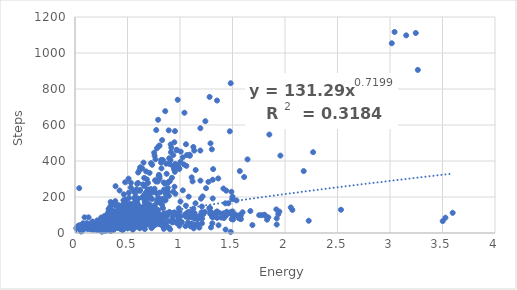
| Category | Steps |
|---|---|
| 0.2355 | 68 |
| 0.7919999999999999 | 55 |
| 0.7288571428571428 | 102 |
| 0.7101 | 334 |
| 0.5065 | 48 |
| 0.181 | 41 |
| 0.6684444444444445 | 176 |
| 0.172 | 37 |
| 1.211 | 80 |
| 1.1475 | 165 |
| 0.6620909090909092 | 260 |
| 0.223 | 35 |
| 0.124 | 27 |
| 0.092 | 25 |
| 1.209 | 54 |
| 0.7837 | 182 |
| 0.7837 | 172 |
| 0.8087777777777778 | 225 |
| 0.8896000000000001 | 282 |
| 0.5495 | 107 |
| 0.683 | 60 |
| 0.521 | 68 |
| 0.6083333333333333 | 93 |
| 0.673875 | 96 |
| 1.289 | 118 |
| 1.569625 | 344 |
| 1.776 | 99 |
| 1.807 | 100 |
| 0.727 | 33 |
| 0.342 | 23 |
| 0.2822 | 29 |
| 0.35444444444444445 | 59 |
| 0.347125 | 77 |
| 0.37200000000000005 | 20 |
| 0.9015833333333334 | 383 |
| 0.201 | 18 |
| 0.7879999999999999 | 173 |
| 0.5661250000000001 | 192 |
| 0.081 | 27 |
| 0.3807777777777777 | 82 |
| 0.42619999999999997 | 80 |
| 0.43433333333333335 | 75 |
| 0.43722222222222223 | 106 |
| 0.289 | 37 |
| 0.3672 | 86 |
| 0.35716666666666663 | 80 |
| 0.2643636363636364 | 54 |
| 0.8233846153846153 | 359 |
| 0.7581538461538462 | 429 |
| 0.7660666666666668 | 409 |
| 1.353 | 120 |
| 1.936 | 105 |
| 0.9276666666666666 | 86 |
| 0.4415 | 55 |
| 0.6661428571428571 | 159 |
| 0.5529999999999999 | 46 |
| 0.588142857142857 | 172 |
| 0.43800000000000006 | 69 |
| 0.2905 | 56 |
| 0.057 | 15 |
| 0.3216666666666667 | 16 |
| 0.3049 | 38 |
| 0.41600000000000004 | 27 |
| 0.36012500000000003 | 49 |
| 0.36012500000000003 | 56 |
| 0.2855 | 41 |
| 0.505 | 94 |
| 0.7914705882352943 | 629 |
| 0.317 | 49 |
| 1.142 | 79 |
| 1.131 | 98 |
| 0.66 | 84 |
| 0.5830000000000001 | 64 |
| 0.869375 | 385 |
| 1.4135 | 247 |
| 0.6408 | 107 |
| 1.353 | 84 |
| 0.38849999999999996 | 73 |
| 0.095 | 26 |
| 0.461 | 28 |
| 0.7605999999999999 | 148 |
| 0.521 | 116 |
| 0.5225000000000001 | 92 |
| 0.5225000000000001 | 57 |
| 0.322 | 18 |
| 0.5894285714285715 | 91 |
| 0.45549999999999996 | 25 |
| 1.0476666666666667 | 102 |
| 0.375 | 58 |
| 0.8963571428571429 | 415 |
| 1.122 | 111 |
| 1.443 | 103 |
| 1.131 | 26 |
| 1.392 | 86 |
| 0.6805555555555556 | 143 |
| 0.6805555555555556 | 104 |
| 0.5905714285714285 | 124 |
| 0.444125 | 146 |
| 0.41850000000000004 | 54 |
| 0.4171428571428572 | 123 |
| 0.498 | 87 |
| 0.40066666666666667 | 38 |
| 0.6267777777777779 | 143 |
| 0.49600000000000005 | 84 |
| 0.43520000000000003 | 22 |
| 0.5825 | 46 |
| 0.7589999999999999 | 75 |
| 0.4650000000000001 | 215 |
| 0.7224444444444444 | 244 |
| 0.617125 | 26 |
| 0.222 | 28 |
| 0.43439999999999995 | 150 |
| 0.39025 | 103 |
| 0.4151999999999999 | 110 |
| 0.5853333333333334 | 121 |
| 0.97975 | 374 |
| 1.492 | 77 |
| 0.8455 | 106 |
| 0.8285 | 81 |
| 0.285 | 21 |
| 0.8835714285714286 | 251 |
| 0.41871428571428576 | 52 |
| 0.38599999999999995 | 69 |
| 0.5128888888888888 | 136 |
| 0.4614 | 127 |
| 0.5147 | 195 |
| 0.582125 | 117 |
| 0.067 | 12 |
| 0.527 | 99 |
| 0.36574999999999996 | 36 |
| 0.23075 | 26 |
| 0.23075 | 20 |
| 0.4468571428571429 | 56 |
| 0.313 | 17 |
| 0.46099999999999997 | 48 |
| 0.20425 | 36 |
| 0.30025 | 42 |
| 0.3501666666666667 | 46 |
| 0.3662 | 52 |
| 0.414 | 36 |
| 0.39440000000000003 | 46 |
| 0.29733333333333334 | 36 |
| 0.30949999999999994 | 53 |
| 0.9695714285714285 | 462 |
| 0.361 | 31 |
| 0.927 | 61 |
| 0.9329999999999999 | 111 |
| 1.118 | 94 |
| 0.7110000000000001 | 119 |
| 0.6788181818181819 | 164 |
| 0.7652000000000001 | 46 |
| 0.318 | 60 |
| 1.5003333333333335 | 202 |
| 0.7090000000000001 | 206 |
| 0.7090000000000001 | 206 |
| 3.502 | 66 |
| 0.681 | 109 |
| 1.367 | 43 |
| 0.476 | 187 |
| 1.496 | 101 |
| 1.4316666666666666 | 165 |
| 1.237 | 117 |
| 0.5786 | 70 |
| 0.41974999999999996 | 80 |
| 0.494 | 32 |
| 0.49099999999999994 | 35 |
| 0.44399999999999995 | 23 |
| 0.6017142857142856 | 336 |
| 0.242 | 15 |
| 0.30833333333333335 | 35 |
| 0.33699999999999997 | 27 |
| 0.8465714285714286 | 280 |
| 0.6148571428571429 | 93 |
| 0.409 | 45 |
| 0.8861111111111111 | 227 |
| 0.225 | 26 |
| 0.9361249999999999 | 230 |
| 0.5922000000000001 | 89 |
| 0.6885 | 75 |
| 0.84775 | 241 |
| 0.3574285714285714 | 85 |
| 0.287 | 33 |
| 0.46875 | 104 |
| 0.6984999999999999 | 64 |
| 0.8147499999999999 | 166 |
| 0.609625 | 47 |
| 0.65 | 53 |
| 0.408875 | 112 |
| 0.34766666666666673 | 78 |
| 0.5826666666666667 | 60 |
| 0.47624999999999995 | 77 |
| 0.114 | 39 |
| 0.623125 | 131 |
| 0.473875 | 117 |
| 0.6515 | 65 |
| 0.314 | 71 |
| 0.21900000000000003 | 23 |
| 0.509 | 126 |
| 0.247 | 54 |
| 1.559 | 83 |
| 0.5511111111111112 | 141 |
| 1.1165 | 102 |
| 0.401 | 38 |
| 0.7373333333333333 | 129 |
| 0.601 | 35 |
| 1.1273333333333333 | 135 |
| 0.16699999999999998 | 32 |
| 1.3056666666666668 | 89 |
| 0.647 | 111 |
| 1.8508000000000002 | 547 |
| 1.006 | 93 |
| 1.4743000000000002 | 565 |
| 1.3156666666666665 | 355 |
| 0.39399999999999996 | 41 |
| 0.8542000000000002 | 226 |
| 0.8542000000000002 | 275 |
| 0.45299999999999996 | 15 |
| 0.34625 | 45 |
| 2.07 | 128 |
| 0.429 | 36 |
| 0.247 | 59 |
| 0.3204444444444445 | 65 |
| 0.39 | 44 |
| 0.8275714285714285 | 186 |
| 3.528 | 85 |
| 0.41450000000000004 | 80 |
| 0.41450000000000004 | 89 |
| 0.042 | 43 |
| 1.921 | 47 |
| 0.5681666666666667 | 84 |
| 0.27740000000000004 | 63 |
| 0.152 | 22 |
| 0.6333333333333333 | 59 |
| 0.37188888888888894 | 107 |
| 0.37188888888888894 | 64 |
| 0.41411111111111115 | 36 |
| 0.4962857142857143 | 89 |
| 0.391625 | 115 |
| 0.38425 | 66 |
| 0.733 | 93 |
| 0.166 | 64 |
| 0.25 | 86 |
| 0.25 | 55 |
| 0.7548333333333331 | 153 |
| 0.739 | 35 |
| 0.6145384615384615 | 349 |
| 0.5322499999999999 | 279 |
| 0.6290000000000001 | 114 |
| 2.0549999999999997 | 142 |
| 1.917333333333333 | 131 |
| 0.7985 | 106 |
| 1.0045 | 175 |
| 0.36037500000000006 | 60 |
| 0.877 | 98 |
| 0.6456 | 139 |
| 0.713 | 52 |
| 1.4898571428571425 | 229 |
| 1.2479999999999998 | 249 |
| 0.4064285714285714 | 121 |
| 0.36366666666666664 | 76 |
| 0.37316666666666665 | 47 |
| 0.314 | 52 |
| 0.28 | 94 |
| 0.9678421052631578 | 460 |
| 3.597 | 112 |
| 0.8905000000000001 | 66 |
| 0.30254545454545456 | 78 |
| 0.38630000000000003 | 99 |
| 0.32314285714285723 | 55 |
| 0.49666666666666665 | 120 |
| 0.4146666666666667 | 62 |
| 0.363090909090909 | 65 |
| 0.38025 | 33 |
| 0.6543333333333333 | 122 |
| 0.630375 | 128 |
| 0.4505 | 89 |
| 0.45228571428571435 | 107 |
| 0.5013333333333333 | 26 |
| 0.3237272727272727 | 31 |
| 0.4635555555555556 | 110 |
| 0.427 | 151 |
| 0.3470000000000001 | 62 |
| 0.9518666666666664 | 566 |
| 0.859 | 54 |
| 1.063 | 99 |
| 1.418 | 83 |
| 1.453 | 112 |
| 1.138 | 82 |
| 0.5312857142857143 | 253 |
| 0.846 | 36 |
| 0.212 | 70 |
| 0.9021666666666667 | 288 |
| 0.842 | 102 |
| 0.47792307692307684 | 282 |
| 1.075 | 58 |
| 0.43115384615384617 | 134 |
| 0.46975 | 103 |
| 0.4069 | 31 |
| 0.3337777777777778 | 105 |
| 0.3242857142857143 | 20 |
| 0.7286666666666667 | 238 |
| 0.4574 | 138 |
| 0.41633333333333333 | 128 |
| 0.9175000000000001 | 474 |
| 0.8594545454545454 | 677 |
| 0.22425 | 38 |
| 0.33445454545454545 | 91 |
| 0.076 | 54 |
| 2.533 | 129 |
| 0.029 | 39 |
| 1.111 | 309 |
| 0.7935000000000001 | 92 |
| 0.3196666666666667 | 46 |
| 0.551 | 18 |
| 1.1493333333333333 | 350 |
| 1.53 | 102 |
| 0.5266 | 65 |
| 0.4681 | 61 |
| 1.166 | 49 |
| 1.166 | 79 |
| 0.77 | 108 |
| 0.8093333333333333 | 174 |
| 0.371 | 24 |
| 0.742 | 50 |
| 0.349 | 29 |
| 0.568 | 32 |
| 0.8986666666666666 | 117 |
| 0.5752727272727273 | 105 |
| 0.204 | 24 |
| 0.314 | 40 |
| 0.33340000000000003 | 83 |
| 0.058 | 8 |
| 0.149 | 27 |
| 0.075 | 19 |
| 0.2425 | 74 |
| 0.803 | 91 |
| 1.0570833333333332 | 493 |
| 0.9964999999999999 | 119 |
| 0.973 | 65 |
| 0.3393333333333333 | 72 |
| 0.294 | 29 |
| 0.36960000000000004 | 58 |
| 0.3854444444444444 | 115 |
| 0.4026666666666667 | 65 |
| 0.35000000000000003 | 40 |
| 0.185 | 30 |
| 0.171 | 49 |
| 0.224 | 27 |
| 0.6821999999999999 | 74 |
| 0.057 | 16 |
| 0.48 | 37 |
| 0.7337777777777778 | 189 |
| 0.5048333333333334 | 53 |
| 0.48300000000000004 | 171 |
| 0.4244545454545454 | 236 |
| 0.5207142857142857 | 94 |
| 0.47425000000000006 | 99 |
| 0.2825714285714286 | 18 |
| 0.37942857142857145 | 61 |
| 0.34733333333333344 | 68 |
| 0.3839 | 177 |
| 0.46233333333333326 | 126 |
| 0.186 | 29 |
| 0.6643333333333334 | 173 |
| 0.47688888888888886 | 134 |
| 0.49011111111111105 | 126 |
| 0.7887500000000002 | 286 |
| 0.7394615384615384 | 226 |
| 0.604 | 46 |
| 1.0937142857142856 | 429 |
| 0.151 | 41 |
| 1.372 | 112 |
| 1.438 | 110 |
| 1.434 | 19 |
| 0.695 | 115 |
| 0.936 | 433 |
| 1.498 | 107 |
| 0.9415 | 66 |
| 0.9275 | 59 |
| 0.31839999999999996 | 59 |
| 0.39385714285714285 | 54 |
| 0.517875 | 128 |
| 0.2886 | 12 |
| 0.79175 | 196 |
| 0.3861818181818181 | 260 |
| 0.674 | 64 |
| 0.41130000000000005 | 155 |
| 0.31175 | 52 |
| 0.2484 | 13 |
| 0.7345999999999999 | 379 |
| 0.08 | 39 |
| 0.614 | 49 |
| 1.4831764705882353 | 832 |
| 0.79 | 128 |
| 1.2416363636363634 | 621 |
| 0.195 | 39 |
| 0.091 | 87 |
| 0.091 | 43 |
| 1.611222222222222 | 311 |
| 0.8294999999999998 | 156 |
| 0.5894 | 58 |
| 0.266 | 21 |
| 0.818125 | 169 |
| 0.861 | 184 |
| 0.417 | 116 |
| 0.890625 | 282 |
| 0.5515 | 65 |
| 0.49983333333333335 | 112 |
| 0.676 | 55 |
| 1.6896 | 44 |
| 0.46275 | 47 |
| 0.5961818181818181 | 163 |
| 0.5560833333333334 | 235 |
| 1.0918 | 117 |
| 0.64 | 62 |
| 0.304 | 28 |
| 0.7290000000000001 | 27 |
| 0.707 | 133 |
| 0.865 | 89 |
| 0.723 | 99 |
| 1.0914444444444444 | 435 |
| 1.45 | 110 |
| 0.705 | 59 |
| 0.34700000000000003 | 26 |
| 0.352125 | 41 |
| 0.3056 | 18 |
| 0.30612500000000004 | 16 |
| 0.2968571428571428 | 24 |
| 0.31499999999999995 | 49 |
| 0.30466666666666664 | 24 |
| 0.2672 | 34 |
| 0.37200000000000005 | 80 |
| 0.4305555555555556 | 67 |
| 0.674 | 46 |
| 0.3363333333333334 | 69 |
| 0.247 | 41 |
| 0.30060000000000003 | 38 |
| 0.30060000000000003 | 36 |
| 0.28750000000000003 | 78 |
| 0.3298571428571429 | 22 |
| 0.304 | 69 |
| 0.3522666666666667 | 167 |
| 1.2085 | 147 |
| 1.2705 | 284 |
| 1.308 | 54 |
| 1.335 | 112 |
| 0.987 | 66 |
| 0.9139999999999998 | 449 |
| 0.8725999999999999 | 329 |
| 0.46871428571428575 | 120 |
| 0.4603333333333333 | 77 |
| 0.5127777777777778 | 80 |
| 0.47500000000000003 | 81 |
| 0.29088888888888886 | 24 |
| 0.3341111111111111 | 55 |
| 0.4916666666666667 | 75 |
| 0.5736666666666665 | 76 |
| 0.6295714285714286 | 36 |
| 0.5773333333333334 | 184 |
| 0.8606666666666665 | 181 |
| 0.398 | 53 |
| 0.31670000000000004 | 85 |
| 0.266 | 14 |
| 0.478375 | 122 |
| 0.315 | 21 |
| 0.337 | 27 |
| 0.239 | 41 |
| 0.3998 | 80 |
| 0.519 | 78 |
| 0.8678000000000001 | 213 |
| 0.328 | 34 |
| 0.9932222222222222 | 356 |
| 1.0369 | 381 |
| 0.2434 | 30 |
| 0.27999999999999997 | 17 |
| 1.841 | 87 |
| 0.7802857142857142 | 109 |
| 1.0151428571428571 | 62 |
| 0.691 | 60 |
| 0.994 | 40 |
| 1.0989999999999998 | 37 |
| 1.2001428571428572 | 191 |
| 0.77375 | 222 |
| 0.8606666666666666 | 108 |
| 0.6562 | 85 |
| 0.847 | 38 |
| 0.8069999999999999 | 93 |
| 0.8069999999999999 | 102 |
| 1.0071111111111108 | 452 |
| 1.1938 | 458 |
| 3.0434545454545456 | 1117 |
| 0.984 | 73 |
| 1.52 | 97 |
| 3.1543 | 1098 |
| 3.0168461538461537 | 1054 |
| 3.2453846153846158 | 1111 |
| 3.2653 | 906 |
| 2.17825 | 344 |
| 0.38566666666666666 | 83 |
| 0.3406666666666667 | 47 |
| 0.789 | 68 |
| 0.617 | 234 |
| 0.965 | 58 |
| 0.219 | 17 |
| 0.729 | 83 |
| 0.46681818181818174 | 136 |
| 1.4835 | 6 |
| 1.0658999999999998 | 433 |
| 0.947 | 113 |
| 1.411 | 109 |
| 0.847 | 58 |
| 0.6625 | 85 |
| 0.49239999999999995 | 43 |
| 0.3847777777777778 | 117 |
| 0.317 | 115 |
| 0.3005 | 101 |
| 0.33941666666666664 | 172 |
| 0.653 | 90 |
| 0.3197 | 133 |
| 0.363 | 52 |
| 0.425 | 105 |
| 0.6033750000000001 | 74 |
| 0.5644000000000001 | 165 |
| 0.3911 | 95 |
| 0.537 | 62 |
| 0.113 | 55 |
| 0.6224999999999999 | 85 |
| 0.604 | 43 |
| 0.647 | 49 |
| 0.7121999999999999 | 58 |
| 0.2676666666666667 | 44 |
| 0.3103333333333333 | 60 |
| 0.2182 | 60 |
| 0.333 | 31 |
| 1.2906666666666666 | 498 |
| 0.9924444444444445 | 359 |
| 0.35233333333333333 | 95 |
| 1.0257142857142858 | 420 |
| 0.506 | 71 |
| 0.4653333333333333 | 88 |
| 0.473625 | 57 |
| 0.3595 | 70 |
| 0.3484285714285714 | 52 |
| 0.25650000000000006 | 7 |
| 0.4337777777777778 | 75 |
| 0.4995 | 81 |
| 0.5276 | 162 |
| 0.29 | 27 |
| 0.3205 | 96 |
| 0.867 | 230 |
| 0.6584 | 212 |
| 1.295 | 31 |
| 0.4066666666666667 | 122 |
| 0.63 | 52 |
| 0.33690000000000003 | 72 |
| 0.3225 | 65 |
| 0.40392307692307694 | 77 |
| 0.361 | 16 |
| 0.38985714285714285 | 87 |
| 0.30825 | 70 |
| 0.3117272727272727 | 81 |
| 0.37833333333333335 | 51 |
| 0.35900000000000004 | 98 |
| 0.35209090909090907 | 124 |
| 0.3599230769230769 | 157 |
| 0.9512222222222222 | 340 |
| 1.579 | 97 |
| 0.8634999999999999 | 102 |
| 0.9111818181818182 | 492 |
| 1.829 | 74 |
| 1.119 | 103 |
| 0.602 | 42 |
| 1.173 | 79 |
| 0.7046 | 132 |
| 0.34628571428571436 | 69 |
| 0.191 | 44 |
| 0.27140000000000003 | 78 |
| 0.42390000000000005 | 53 |
| 0.7242500000000001 | 54 |
| 0.346 | 46 |
| 0.769 | 124 |
| 0.181 | 39 |
| 0.585625 | 158 |
| 0.6541250000000001 | 131 |
| 1.184 | 30 |
| 0.665 | 22 |
| 0.6274285714285713 | 53 |
| 0.37 | 19 |
| 0.39 | 40 |
| 1.0422727272727275 | 668 |
| 0.643 | 45 |
| 0.014 | 28 |
| 0.5919285714285715 | 273 |
| 0.6957500000000001 | 146 |
| 0.43042857142857144 | 48 |
| 0.7895 | 65 |
| 0.6223333333333333 | 141 |
| 1.1355833333333332 | 458 |
| 0.9464285714285714 | 504 |
| 0.221 | 27 |
| 1.1199999999999999 | 287 |
| 0.82 | 45 |
| 1.057 | 90 |
| 0.923375 | 307 |
| 1.501 | 120 |
| 1.016 | 60 |
| 0.9345454545454545 | 371 |
| 0.324 | 93 |
| 1.205 | 115 |
| 1.4264999999999999 | 105 |
| 0.8214999999999999 | 56 |
| 0.5927142857142857 | 41 |
| 0.588 | 64 |
| 0.088 | 33 |
| 0.38990909090909087 | 151 |
| 0.153 | 29 |
| 0.5419999999999999 | 63 |
| 1.2865 | 139 |
| 1.461 | 165 |
| 0.21066666666666667 | 23 |
| 0.9884000000000001 | 137 |
| 0.9567272727272728 | 218 |
| 0.558 | 78 |
| 1.2818571428571433 | 756 |
| 1.0705 | 111 |
| 0.6074999999999999 | 112 |
| 1.1395 | 110 |
| 1.303 | 110 |
| 0.795 | 69 |
| 1.3525000000000003 | 736 |
| 1.803 | 101 |
| 1.487 | 107 |
| 1.068 | 112 |
| 1.194 | 99 |
| 0.889 | 106 |
| 0.7542857142857142 | 82 |
| 0.631 | 117 |
| 0.36833333333333335 | 77 |
| 0.268 | 21 |
| 0.805142857142857 | 486 |
| 0.8374999999999999 | 405 |
| 0.3846666666666667 | 53 |
| 0.149 | 26 |
| 0.364 | 26 |
| 0.3807142857142857 | 28 |
| 0.3807142857142857 | 76 |
| 0.3674545454545454 | 122 |
| 0.4331111111111111 | 124 |
| 0.834 | 58 |
| 0.431090909090909 | 86 |
| 0.211 | 30 |
| 0.36822222222222223 | 54 |
| 0.36822222222222223 | 75 |
| 0.49418181818181817 | 154 |
| 0.5458888888888889 | 81 |
| 0.4406 | 118 |
| 0.4659 | 88 |
| 0.4659 | 120 |
| 0.449875 | 99 |
| 0.4538888888888889 | 92 |
| 0.4749999999999999 | 74 |
| 0.49549999999999994 | 122 |
| 0.6622222222222223 | 137 |
| 0.6391818181818182 | 197 |
| 0.5797777777777777 | 136 |
| 0.45 | 73 |
| 0.7806923076923076 | 471 |
| 0.723923076923077 | 388 |
| 0.49666666666666665 | 76 |
| 0.9542000000000002 | 384 |
| 0.681 | 90 |
| 0.45520000000000005 | 126 |
| 0.153 | 20 |
| 0.28971428571428565 | 33 |
| 0.31 | 54 |
| 0.014 | 25 |
| 0.5517999999999998 | 89 |
| 0.5517999999999998 | 90 |
| 0.51925 | 130 |
| 0.447 | 46 |
| 0.3824444444444444 | 50 |
| 0.30528571428571427 | 53 |
| 0.32575 | 25 |
| 0.46114285714285713 | 70 |
| 0.28049999999999997 | 21 |
| 0.805 | 301 |
| 0.805 | 314 |
| 0.292625 | 34 |
| 0.28922222222222227 | 65 |
| 0.49337500000000006 | 124 |
| 0.3225 | 67 |
| 0.057 | 12 |
| 0.3882222222222222 | 38 |
| 0.42263636363636364 | 114 |
| 0.28357142857142853 | 87 |
| 0.3956 | 73 |
| 0.3142222222222222 | 53 |
| 0.21783333333333335 | 24 |
| 0.697888888888889 | 193 |
| 0.33 | 48 |
| 1.145 | 43 |
| 1.1125 | 88 |
| 1.147 | 93 |
| 0.076 | 43 |
| 1.643 | 409 |
| 1.4405000000000001 | 235 |
| 0.846 | 23 |
| 0.817 | 68 |
| 1.2153749999999999 | 203 |
| 1.082857142857143 | 202 |
| 0.8257999999999999 | 188 |
| 0.3906666666666667 | 77 |
| 0.228 | 25 |
| 0.38675000000000004 | 50 |
| 0.38675000000000004 | 64 |
| 0.6569090909090909 | 198 |
| 0.5265 | 45 |
| 0.6776666666666666 | 342 |
| 1.436 | 95 |
| 0.6196666666666667 | 240 |
| 0.9755000000000003 | 111 |
| 0.9755000000000003 | 105 |
| 0.6405000000000001 | 74 |
| 0.8643999999999998 | 108 |
| 0.3145 | 27 |
| 0.798 | 51 |
| 0.6186666666666667 | 89 |
| 0.6186666666666667 | 80 |
| 0.344 | 23 |
| 0.8435454545454545 | 189 |
| 0.893875 | 206 |
| 0.6764999999999999 | 164 |
| 0.6764999999999999 | 226 |
| 0.6393333333333334 | 123 |
| 1.4969999999999999 | 189 |
| 1.315 | 88 |
| 0.527 | 55 |
| 0.4128571428571428 | 30 |
| 1.0805 | 116 |
| 1.58 | 77 |
| 1.3114999999999999 | 296 |
| 0.31 | 16 |
| 1.3644 | 303 |
| 0.5644545454545453 | 164 |
| 0.44930769230769224 | 137 |
| 0.9538181818181819 | 380 |
| 0.906 | 20 |
| 0.1915 | 41 |
| 0.246 | 53 |
| 0.673 | 99 |
| 0.238 | 38 |
| 0.667 | 50 |
| 0.5725 | 58 |
| 0.648 | 73 |
| 0.637 | 59 |
| 1.9562222222222223 | 430 |
| 2.225857142857143 | 68 |
| 0.7575833333333334 | 246 |
| 0.303 | 35 |
| 0.7737692307692308 | 286 |
| 0.37728571428571434 | 45 |
| 0.306 | 22 |
| 0.2902857142857143 | 13 |
| 0.9473076923076924 | 257 |
| 0.812 | 54 |
| 1.279 | 138 |
| 1.506 | 75 |
| 0.49674999999999997 | 113 |
| 1.052 | 38 |
| 0.4526 | 125 |
| 0.5108 | 50 |
| 1.3116666666666668 | 192 |
| 1.946 | 119 |
| 0.156 | 55 |
| 2.267666666666667 | 449 |
| 0.3972 | 83 |
| 0.36822222222222223 | 93 |
| 0.5003333333333332 | 85 |
| 0.334375 | 88 |
| 0.302 | 30 |
| 0.5746666666666667 | 203 |
| 0.6487777777777778 | 270 |
| 0.391625 | 73 |
| 0.058 | 23 |
| 0.3577 | 81 |
| 0.443 | 28 |
| 0.31 | 85 |
| 0.531 | 65 |
| 0.635 | 100 |
| 0.3808571428571429 | 50 |
| 0.30633333333333335 | 22 |
| 0.4027 | 76 |
| 0.4027 | 78 |
| 0.48719999999999997 | 180 |
| 0.805 | 50 |
| 0.6000833333333333 | 278 |
| 0.419 | 58 |
| 1.287 | 107 |
| 1.112 | 53 |
| 0.427 | 57 |
| 1.1945999999999999 | 291 |
| 1.538 | 181 |
| 0.32475 | 18 |
| 0.315 | 28 |
| 0.320375 | 49 |
| 0.77325 | 110 |
| 0.5993 | 144 |
| 0.42679999999999996 | 38 |
| 0.40037500000000004 | 85 |
| 0.569 | 52 |
| 0.569 | 45 |
| 0.5193 | 78 |
| 0.5265555555555554 | 148 |
| 0.8196666666666667 | 391 |
| 0.4445555555555555 | 62 |
| 0.467 | 72 |
| 0.8297000000000001 | 516 |
| 0.129 | 25 |
| 0.6411111111111111 | 359 |
| 0.6943 | 235 |
| 0.5002500000000001 | 121 |
| 1.0034 | 395 |
| 0.8924000000000001 | 570 |
| 0.97825 | 740 |
| 0.802 | 87 |
| 0.859 | 58 |
| 1.0845 | 86 |
| 1.121 | 45 |
| 0.40380000000000005 | 97 |
| 0.88 | 36 |
| 1.1942727272727272 | 582 |
| 1.347 | 113 |
| 1.596 | 115 |
| 1.1724999999999999 | 87 |
| 0.7966666666666666 | 315 |
| 0.6946666666666667 | 242 |
| 0.5132 | 224 |
| 0.6866666666666666 | 215 |
| 0.5938571428571429 | 147 |
| 0.5234545454545455 | 127 |
| 0.6476 | 135 |
| 0.509 | 99 |
| 0.4301111111111111 | 85 |
| 0.3959999999999999 | 85 |
| 0.41783333333333333 | 54 |
| 0.4749999999999999 | 64 |
| 0.37475 | 31 |
| 0.48666666666666675 | 152 |
| 0.318125 | 37 |
| 0.22 | 17 |
| 0.38336363636363635 | 97 |
| 0.3516 | 52 |
| 0.58675 | 70 |
| 0.3584285714285715 | 40 |
| 0.5737272727272728 | 222 |
| 0.364 | 33 |
| 0.543 | 43 |
| 1.221 | 104 |
| 0.8210714285714287 | 406 |
| 1.437 | 110 |
| 0.97 | 97 |
| 0.6526428571428572 | 391 |
| 0.522 | 104 |
| 1.572 | 101 |
| 0.7005 | 63 |
| 0.7905 | 75 |
| 0.526 | 29 |
| 0.2922 | 21 |
| 0.2802 | 48 |
| 0.3335 | 52 |
| 0.3401428571428572 | 95 |
| 0.31999999999999995 | 29 |
| 0.792 | 111 |
| 0.195 | 33 |
| 0.3536999999999999 | 51 |
| 0.6241111111111111 | 99 |
| 0.23 | 39 |
| 0.69575 | 238 |
| 0.971 | 56 |
| 0.7540000000000001 | 446 |
| 0.71 | 106 |
| 0.5843846153846154 | 242 |
| 0.46572727272727277 | 164 |
| 0.6589166666666666 | 306 |
| 0.773764705882353 | 572 |
| 1.486 | 117 |
| 0.99 | 71 |
| 0.41 | 31 |
| 0.999 | 52 |
| 0.6614285714285714 | 114 |
| 0.7254999999999999 | 139 |
| 0.6883 | 137 |
| 0.897 | 28 |
| 0.173 | 18 |
| 0.591625 | 81 |
| 0.459 | 20 |
| 0.18066666666666667 | 24 |
| 0.5626666666666666 | 95 |
| 0.8376666666666667 | 138 |
| 0.5756666666666667 | 33 |
| 0.7992222222222222 | 323 |
| 0.121 | 22 |
| 1.571 | 80 |
| 0.129 | 87 |
| 1.921 | 81 |
| 0.6025454545454546 | 191 |
| 0.6950833333333333 | 278 |
| 0.8594999999999999 | 104 |
| 0.663 | 55 |
| 0.7622857142857142 | 293 |
| 0.683 | 47 |
| 0.5575 | 109 |
| 0.35800000000000004 | 81 |
| 1.754 | 99 |
| 1.67 | 122 |
| 0.6839999999999999 | 298 |
| 0.684 | 200 |
| 0.04 | 249 |
| 1.056 | 152 |
| 0.5935 | 130 |
| 0.9095833333333334 | 405 |
| 0.9427999999999999 | 355 |
| 0.3795 | 63 |
| 0.2307142857142857 | 49 |
| 0.3365 | 37 |
| 0.3388 | 11 |
| 0.329 | 51 |
| 0.31475000000000003 | 24 |
| 0.335 | 63 |
| 0.31639999999999996 | 21 |
| 0.46136363636363636 | 181 |
| 0.574 | 118 |
| 1.0611000000000002 | 373 |
| 0.712 | 48 |
| 0.706 | 161 |
| 0.7162 | 99 |
| 0.48866666666666664 | 156 |
| 0.5922000000000001 | 159 |
| 0.41409090909090907 | 126 |
| 0.114 | 28 |
| 0.322375 | 46 |
| 0.346 | 65 |
| 0.3165 | 40 |
| 0.3645555555555556 | 81 |
| 0.2862222222222222 | 69 |
| 0.7455 | 103 |
| 0.3364 | 148 |
| 0.3335555555555556 | 86 |
| 0.32455555555555554 | 51 |
| 0.33466666666666667 | 74 |
| 1.3034444444444442 | 465 |
| 1.1271666666666664 | 478 |
| 0.800076923076923 | 483 |
| 1.445 | 118 |
| 0.9315 | 107 |
| 0.541 | 89 |
| 0.644 | 34 |
| 0.41133333333333333 | 42 |
| 0.3455 | 41 |
| 0.346 | 39 |
| 0.33140000000000003 | 37 |
| 0.4881111111111111 | 99 |
| 0.458 | 59 |
| 0.3065555555555555 | 37 |
| 0.876375 | 240 |
| 1.027 | 237 |
| 0.995 | 60 |
| 0.6204615384615385 | 365 |
| 0.471 | 32 |
| 0.5099166666666667 | 302 |
| 0.7545000000000001 | 43 |
| 0.27012499999999995 | 23 |
| 0.5704444444444444 | 85 |
| 0.3373333333333333 | 37 |
| 0.31285714285714283 | 81 |
| 0.3234 | 22 |